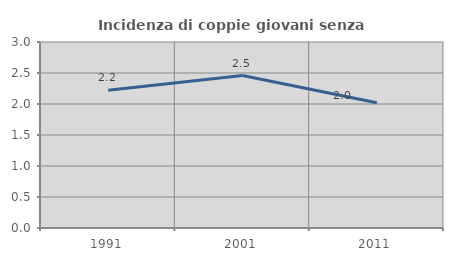
| Category | Incidenza di coppie giovani senza figli |
|---|---|
| 1991.0 | 2.222 |
| 2001.0 | 2.459 |
| 2011.0 | 2.02 |